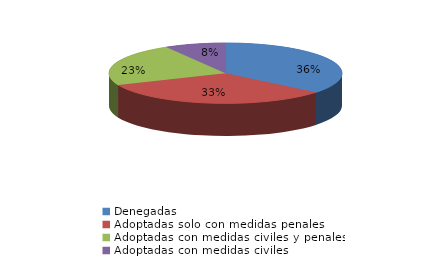
| Category | Series 0 |
|---|---|
| Denegadas | 281 |
| Adoptadas solo con medidas penales | 256 |
| Adoptadas con medidas civiles y penales | 180 |
| Adoptadas con medidas civiles | 66 |